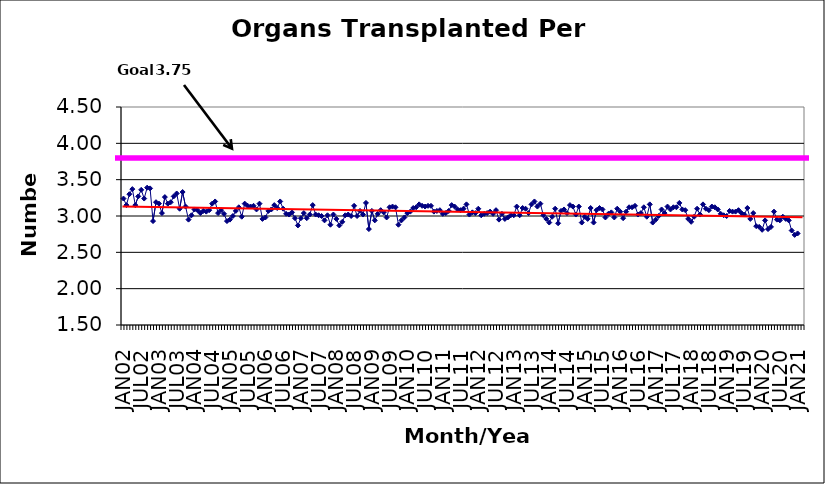
| Category | Series 0 |
|---|---|
| JAN02 | 3.24 |
| FEB02 | 3.15 |
| MAR02 | 3.3 |
| APR02 | 3.37 |
| MAY02 | 3.15 |
| JUN02 | 3.27 |
| JUL02 | 3.36 |
| AUG02 | 3.24 |
| SEP02 | 3.39 |
| OCT02 | 3.38 |
| NOV02 | 2.93 |
| DEC02 | 3.19 |
| JAN03 | 3.17 |
| FEB03 | 3.04 |
| MAR03 | 3.26 |
| APR03 | 3.17 |
| MAY03 | 3.19 |
| JUN03 | 3.27 |
| JUL03 | 3.31 |
| AUG03 | 3.1 |
| SEP03 | 3.33 |
| OCT03 | 3.13 |
| NOV03 | 2.95 |
| DEC03 | 3.01 |
| JAN04 | 3.09 |
| FEB04 | 3.08 |
| MAR04 | 3.04 |
| APR04 | 3.07 |
| MAY04 | 3.06 |
| JUN04 | 3.08 |
| JUL04 | 3.17 |
| AUG04 | 3.2 |
| SEP04 | 3.04 |
| OCT04 | 3.08 |
| NOV04 | 3.03 |
| DEC04 | 2.93 |
| JAN05 | 2.95 |
| FEB05 | 3 |
| MAR05 | 3.07 |
| APR05 | 3.12 |
| MAY05 | 2.99 |
| JUN05 | 3.17 |
| JUL05 | 3.14 |
| AUG05 | 3.13 |
| SEP05 | 3.14 |
| OCT05 | 3.09 |
| NOV05 | 3.17 |
| DEC05 | 2.96 |
| JAN06 | 2.98 |
| FEB06 | 3.07 |
| MAR06 | 3.09 |
| APR06 | 3.15 |
| MAY06 | 3.11 |
| JUN06 | 3.2 |
| JUL06 | 3.1 |
| AUG06 | 3.03 |
| SEP06 | 3.02 |
| OCT06 | 3.05 |
| NOV06 | 2.97 |
| DEC06 | 2.87 |
| JAN07 | 2.97 |
| FEB07 | 3.04 |
| MAR07 | 2.97 |
| APR07 | 3.02 |
| MAY07 | 3.15 |
| JUN07 | 3.02 |
| JUL07 | 3.01 |
| AUG07 | 3 |
| SEP07 | 2.94 |
| OCT07 | 3.01 |
| NOV07 | 2.88 |
| DEC07 | 3.02 |
| JAN08 | 2.96 |
| FEB08 | 2.87 |
| MAR08 | 2.92 |
| APR08 | 3.01 |
| MAY08 | 3.02 |
| JUN08 | 3 |
| JUL08 | 3.14 |
| AUG08 | 3 |
| SEP08 | 3.07 |
| OCT08 | 3.02 |
| NOV08 | 3.18 |
| DEC08 | 2.82 |
| JAN09 | 3.07 |
| FEB09 | 2.94 |
| MAR09 | 3.03 |
| APR09 | 3.08 |
| MAY09 | 3.05 |
| JUN09 | 2.98 |
| JUL09 | 3.12 |
| AUG09 | 3.13 |
| SEP09 | 3.12 |
| OCT09 | 2.88 |
| NOV09 | 2.94 |
| DEC09 | 2.98 |
| JAN10 | 3.04 |
| FEB10 | 3.06 |
| MAR10 | 3.11 |
| APR10 | 3.12 |
| MAY10 | 3.16 |
| JUN10 | 3.14 |
| JUL10 | 3.13 |
| AUG10 | 3.14 |
| SEP10 | 3.14 |
| OCT10 | 3.06 |
| NOV10 | 3.07 |
| DEC10 | 3.08 |
| JAN11 | 3.03 |
| FEB11 | 3.04 |
| MAR11 | 3.07 |
| APR11 | 3.15 |
| MAY11 | 3.13 |
| JUN11 | 3.09 |
| JUL11 | 3.08 |
| AUG11 | 3.1 |
| SEP11 | 3.16 |
| OCT11 | 3.02 |
| NOV11 | 3.05 |
| DEC11 | 3.04 |
| JAN12 | 3.1 |
| FEB12 | 3.01 |
| MAR12 | 3.03 |
| APR12 | 3.04 |
| MAY12 | 3.06 |
| JUN12 | 3.03 |
| JUL12 | 3.08 |
| AUG12 | 2.95 |
| SEP12 | 3.03 |
| OCT12 | 2.96 |
| NOV12 | 2.98 |
| DEC12 | 3.01 |
| JAN13 | 3.01 |
| FEB13 | 3.13 |
| MAR13 | 3.01 |
| APR13 | 3.11 |
| MAY13 | 3.1 |
| JUN13 | 3.04 |
| JUL13 | 3.16 |
| AUG13 | 3.2 |
| SEP13 | 3.13 |
| OCT13 | 3.17 |
| NOV13 | 3.01 |
| DEC13 | 2.96 |
| JAN14 | 2.91 |
| FEB14 | 2.99 |
| MAR14 | 3.1 |
| APR14 | 2.9 |
| MAY14 | 3.07 |
| JUN14 | 3.09 |
| JUL14 | 3.04 |
| AUG14 | 3.15 |
| SEP14 | 3.13 |
| OCT14 | 3.02 |
| NOV14 | 3.13 |
| DEC14 | 2.91 |
| JAN15 | 2.99 |
| FEB15 | 2.96 |
| MAR15 | 3.11 |
| APR15 | 2.91 |
| MAY15 | 3.08 |
| JUN15 | 3.11 |
| JUL15 | 3.09 |
| AUG15 | 2.98 |
| SEP15 | 3.03 |
| OCT15 | 3.05 |
| NOV15 | 2.98 |
| DEC15 | 3.1 |
| JAN16 | 3.06 |
| FEB16 | 2.97 |
| MAR16 | 3.06 |
| APR16 | 3.12 |
| MAY16 | 3.12 |
| JUN16 | 3.14 |
| JUL16 | 3.02 |
| AUG16 | 3.04 |
| SEP16 | 3.12 |
| OCT16 | 2.99 |
| NOV16 | 3.16 |
| DEC16 | 2.91 |
| JAN17 | 2.95 |
| FEB17 | 3 |
| MAR17 | 3.09 |
| APR17 | 3.04 |
| MAY17 | 3.13 |
| JUN17 | 3.09 |
| JUL17 | 3.12 |
| AUG17 | 3.12 |
| SEP17 | 3.18 |
| OCT17 | 3.09 |
| NOV17 | 3.08 |
| DEC17 | 2.96 |
| JAN18 | 2.92 |
| FEB18 | 2.99 |
| MAR18 | 3.1 |
| APR18 | 3.02 |
| MAY18 | 3.16 |
| JUN18 | 3.1 |
| JUL18 | 3.08 |
| AUG18 | 3.13 |
| SEP18 | 3.12 |
| OCT18 | 3.09 |
| NOV18 | 3.03 |
| DEC18 | 3.01 |
| JAN19 | 3 |
| FEB19 | 3.07 |
| MAR19 | 3.06 |
| APR19 | 3.06 |
| MAY19 | 3.08 |
| JUN19 | 3.04 |
| JUL19 | 3.02 |
| AUG19 | 3.11 |
| SEP19 | 2.96 |
| OCT19 | 3.04 |
| NOV19 | 2.86 |
| DEC19 | 2.85 |
| JAN20 | 2.81 |
| FEB20 | 2.94 |
| MAR20 | 2.82 |
| APR20 | 2.85 |
| MAY20 | 3.06 |
| JUN20 | 2.95 |
| JUL20 | 2.94 |
| AUG20 | 2.99 |
| SEP20 | 2.96 |
| OCT20 | 2.94 |
| NOV20 | 2.8 |
| DEC20 | 2.74 |
| JAN21 | 2.76 |